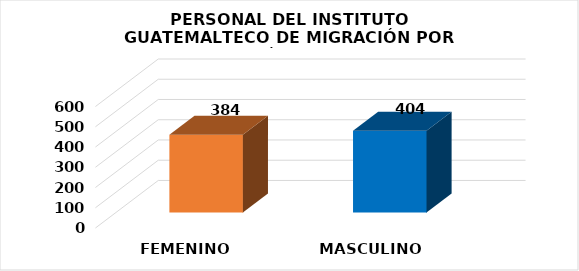
| Category | Series 0 |
|---|---|
| FEMENINO | 384 |
| MASCULINO | 404 |